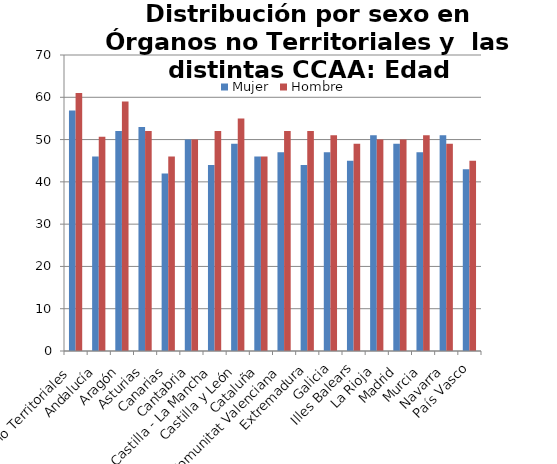
| Category | Mujer | Hombre |
|---|---|---|
| Órganos no Territoriales | 56.89 | 61 |
| Andalucía | 46 | 50.65 |
| Aragón | 52 | 59 |
| Asturias | 53 | 52 |
| Canarias | 42 | 46 |
| Cantabria | 50 | 50 |
| Castilla - La Mancha | 44 | 52 |
| Castilla y León | 49 | 55 |
| Cataluña | 46 | 46 |
| Comunitat Valenciana | 47 | 52 |
| Extremadura | 44 | 52 |
| Galicia | 47 | 51 |
| Illes Balears | 45 | 49 |
| La Rioja | 51 | 50 |
| Madrid | 49 | 50 |
| Murcia | 47 | 51 |
| Navarra | 51 | 49 |
| País Vasco | 43 | 45 |